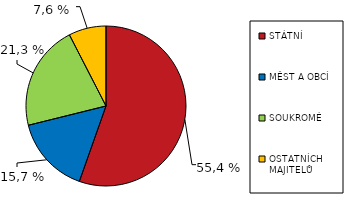
| Category | 2015 |
|---|---|
| STÁTNÍ | 1478528 |
| MĚST A OBCÍ | 419421 |
| SOUKROMÉ | 568736 |
| OSTATNÍCH MAJITELŮ | 201707 |